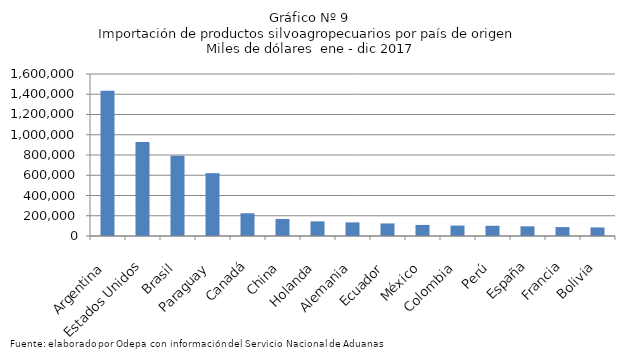
| Category | Series 0 |
|---|---|
| Argentina | 1433369.141 |
| Estados Unidos | 927625.657 |
| Brasil | 792667.784 |
| Paraguay | 620601.291 |
| Canadá | 224415.989 |
| China | 168296.441 |
| Holanda | 144319.219 |
| Alemania | 134349.183 |
| Ecuador | 124101.111 |
| México | 109305.23 |
| Colombia | 103238.195 |
| Perú | 100842.787 |
| España | 95625.804 |
| Francia | 88057.879 |
| Bolivia | 84592.277 |